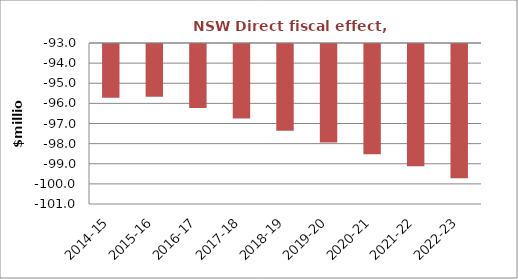
| Category | Series 0 |
|---|---|
| 2014-15 | -95.674 |
| 2015-16 | -95.624 |
| 2016-17 | -96.184 |
| 2017-18 | -96.699 |
| 2018-19 | -97.316 |
| 2019-20 | -97.895 |
| 2020-21 | -98.48 |
| 2021-22 | -99.069 |
| 2022-23 | -99.675 |